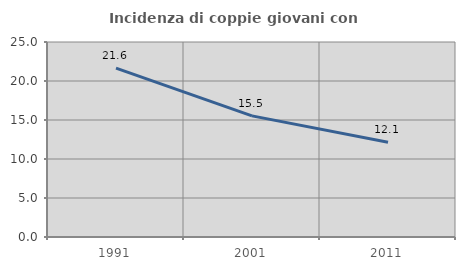
| Category | Incidenza di coppie giovani con figli |
|---|---|
| 1991.0 | 21.646 |
| 2001.0 | 15.527 |
| 2011.0 | 12.142 |